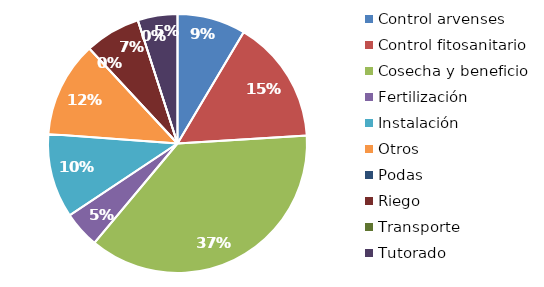
| Category | Valor |
|---|---|
| Control arvenses | 1290000 |
| Control fitosanitario | 2340000 |
| Cosecha y beneficio | 5600000 |
| Fertilización | 690000 |
| Instalación | 1590000 |
| Otros | 1800000 |
| Podas | 0 |
| Riego | 1050000 |
| Transporte | 0 |
| Tutorado | 750000 |